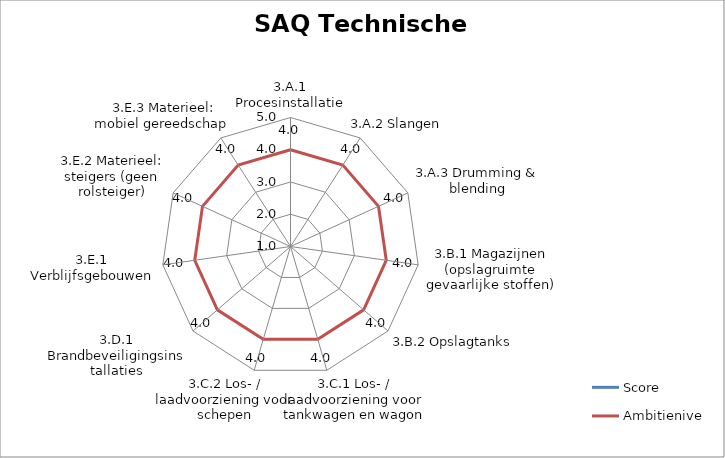
| Category | Score | Ambitieniveau |
|---|---|---|
| 3.A.1 Procesinstallatie | 1 | 4 |
| 3.A.2 Slangen | 1 | 4 |
| 3.A.3 Drumming & blending | 1 | 4 |
| 3.B.1 Magazijnen (opslagruimte gevaarlijke stoffen) | 1 | 4 |
| 3.B.2 Opslagtanks | 1 | 4 |
| 3.C.1 Los- / laadvoorziening voor tankwagen en wagon | 1 | 4 |
| 3.C.2 Los- / laadvoorziening voor schepen | 1 | 4 |
| 3.D.1 Brandbeveiligingsinstallaties | 1 | 4 |
| 3.E.1 Verblijfsgebouwen | 1 | 4 |
| 3.E.2 Materieel: steigers (geen rolsteiger) | 1 | 4 |
| 3.E.3 Materieel: mobiel gereedschap  | 1 | 4 |